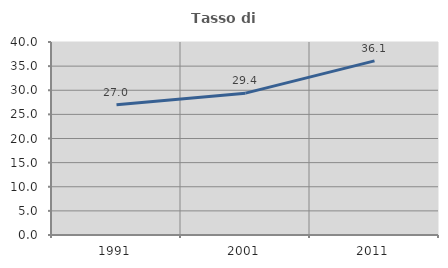
| Category | Tasso di occupazione   |
|---|---|
| 1991.0 | 27.015 |
| 2001.0 | 29.4 |
| 2011.0 | 36.087 |